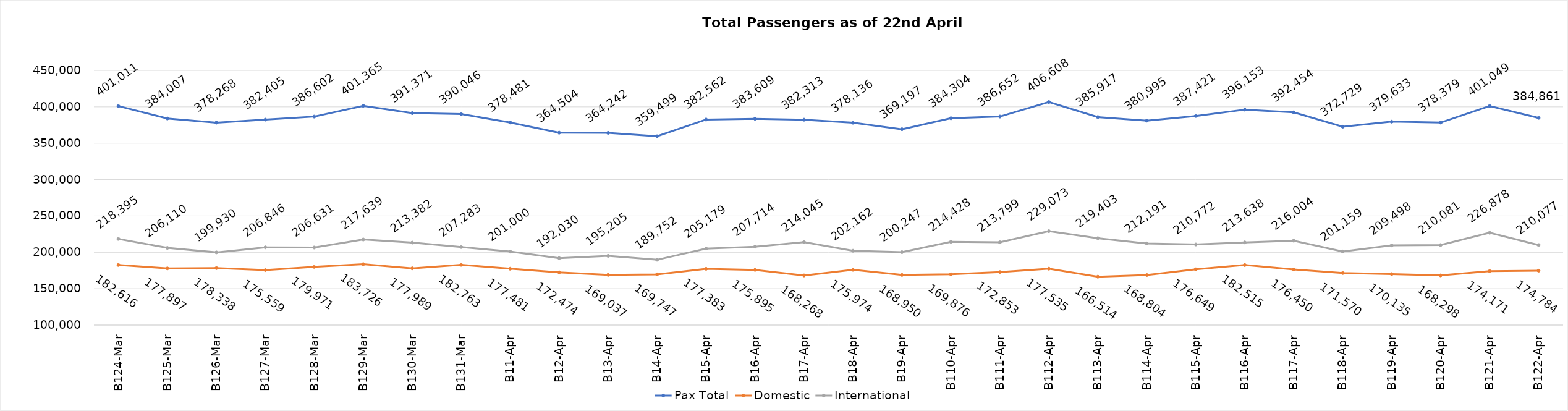
| Category | Pax Total | Domestic | International |
|---|---|---|---|
| 2024-03-24 | 401011 | 182616 | 218395 |
| 2024-03-25 | 384007 | 177897 | 206110 |
| 2024-03-26 | 378268 | 178338 | 199930 |
| 2024-03-27 | 382405 | 175559 | 206846 |
| 2024-03-28 | 386602 | 179971 | 206631 |
| 2024-03-29 | 401365 | 183726 | 217639 |
| 2024-03-30 | 391371 | 177989 | 213382 |
| 2024-03-31 | 390046 | 182763 | 207283 |
| 2024-04-01 | 378481 | 177481 | 201000 |
| 2024-04-02 | 364504 | 172474 | 192030 |
| 2024-04-03 | 364242 | 169037 | 195205 |
| 2024-04-04 | 359499 | 169747 | 189752 |
| 2024-04-05 | 382562 | 177383 | 205179 |
| 2024-04-06 | 383609 | 175895 | 207714 |
| 2024-04-07 | 382313 | 168268 | 214045 |
| 2024-04-08 | 378136 | 175974 | 202162 |
| 2024-04-09 | 369197 | 168950 | 200247 |
| 2024-04-10 | 384304 | 169876 | 214428 |
| 2024-04-11 | 386652 | 172853 | 213799 |
| 2024-04-12 | 406608 | 177535 | 229073 |
| 2024-04-13 | 385917 | 166514 | 219403 |
| 2024-04-14 | 380995 | 168804 | 212191 |
| 2024-04-15 | 387421 | 176649 | 210772 |
| 2024-04-16 | 396153 | 182515 | 213638 |
| 2024-04-17 | 392454 | 176450 | 216004 |
| 2024-04-18 | 372729 | 171570 | 201159 |
| 2024-04-19 | 379633 | 170135 | 209498 |
| 2024-04-20 | 378379 | 168298 | 210081 |
| 2024-04-21 | 401049 | 174171 | 226878 |
| 2024-04-22 | 384861 | 174784 | 210077 |